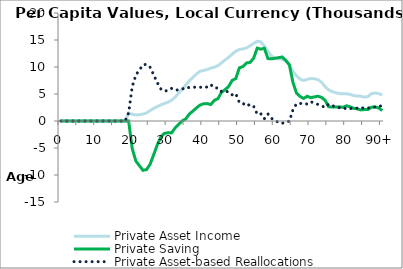
| Category | Private Asset Income | Private Saving | Private Asset-based Reallocations |
|---|---|---|---|
| 0 | 0 | 0 | 0 |
|  | 0 | 0 | 0 |
| 2 | 0 | 0 | 0 |
| 3 | 0 | 0 | 0 |
| 4 | 0 | 0 | 0 |
| 5 | 0 | 0 | 0 |
| 6 | 0 | 0 | 0 |
| 7 | 0 | 0 | 0 |
| 8 | 0 | 0 | 0 |
| 9 | 0 | 0 | 0 |
| 10 | 0 | 0 | 0 |
| 11 | 0 | 0 | 0 |
| 12 | 0 | 0 | 0 |
| 13 | 0 | 0 | 0 |
| 14 | 0 | 0 | 0 |
| 15 | 0 | 0 | 0 |
| 16 | 0 | 0 | 0 |
| 17 | 0 | 0 | 0 |
| 18 | -39.151 | 0 | -39.151 |
| 19 | 1506.614 | 0 | 1506.614 |
| 20 | 1242.833 | -5095.875 | 6338.708 |
| 21 | 1102.254 | -7388.339 | 8490.593 |
| 22 | 1173.971 | -8262.647 | 9436.618 |
| 23 | 1276.18 | -9129.099 | 10405.279 |
| 24 | 1487.969 | -9007.453 | 10495.422 |
| 25 | 1929.606 | -8025.965 | 9955.572 |
| 26 | 2313.009 | -6252.181 | 8565.191 |
| 27 | 2676.693 | -4449.359 | 7126.051 |
| 28 | 2978.54 | -2978.211 | 5956.751 |
| 29 | 3231.779 | -2301.312 | 5533.091 |
| 30 | 3481.351 | -2175.828 | 5657.179 |
| 31 | 3834.657 | -2205.33 | 6039.987 |
| 32 | 4403.03 | -1308.016 | 5711.046 |
| 33 | 5165.316 | -607.924 | 5773.24 |
| 34 | 5907.844 | 17.662 | 5890.182 |
| 35 | 6672.336 | 399.675 | 6272.66 |
| 36 | 7472.999 | 1298.698 | 6174.3 |
| 37 | 8084.598 | 1838.631 | 6245.967 |
| 38 | 8712.976 | 2443.368 | 6269.608 |
| 39 | 9206.98 | 2946.676 | 6260.303 |
| 40 | 9369.815 | 3199.581 | 6170.234 |
| 41 | 9531.844 | 3221.804 | 6310.04 |
| 42 | 9792.728 | 3054.474 | 6738.254 |
| 43 | 9959.509 | 3825.744 | 6133.765 |
| 44 | 10248.553 | 4136.157 | 6112.396 |
| 45 | 10752.905 | 5312.15 | 5440.755 |
| 46 | 11304.367 | 5806.438 | 5497.928 |
| 47 | 11795.246 | 6390.374 | 5404.872 |
| 48 | 12378.367 | 7535.84 | 4842.527 |
| 49 | 12908.547 | 7846.895 | 5061.652 |
| 50 | 13254.224 | 9842.842 | 3411.382 |
| 51 | 13346.991 | 10079.722 | 3267.269 |
| 52 | 13528.396 | 10756.121 | 2772.275 |
| 53 | 13928.622 | 10845.857 | 3082.765 |
| 54 | 14361.045 | 11631.383 | 2729.662 |
| 55 | 14763.837 | 13497.988 | 1265.849 |
| 56 | 14654.01 | 13306.07 | 1347.94 |
| 57 | 13887.711 | 13465.469 | 422.242 |
| 58 | 12878.47 | 11567.741 | 1310.73 |
| 59 | 12003.173 | 11504.278 | 498.895 |
| 60 | 11625.603 | 11615.113 | 10.49 |
| 61 | 11532.099 | 11734.809 | -202.709 |
| 62 | 11421.536 | 11856.241 | -434.705 |
| 63 | 11122.089 | 11226.214 | -104.125 |
| 64 | 10348.005 | 10407.783 | -59.778 |
| 65 | 9221.604 | 7153.893 | 2067.711 |
| 66 | 8353.127 | 5168.635 | 3184.492 |
| 67 | 7777.662 | 4545.786 | 3231.876 |
| 68 | 7483.474 | 4168.592 | 3314.882 |
| 69 | 7714.888 | 4584.522 | 3130.366 |
| 70 | 7858.101 | 4307.733 | 3550.368 |
| 71 | 7808.662 | 4460.41 | 3348.253 |
| 72 | 7665.296 | 4598.861 | 3066.435 |
| 73 | 7173.339 | 4376.043 | 2797.296 |
| 74 | 6361.005 | 3841.588 | 2519.416 |
| 75 | 5764.641 | 2634.741 | 3129.9 |
| 76 | 5438.832 | 2592.848 | 2845.985 |
| 77 | 5217.736 | 2578.829 | 2638.907 |
| 78 | 5086.653 | 2622.325 | 2464.328 |
| 79 | 5026.584 | 2532.306 | 2494.278 |
| 80 | 5037.795 | 2816.655 | 2221.14 |
| 81 | 4927.866 | 2628.543 | 2299.323 |
| 82 | 4708.25 | 2345.723 | 2362.527 |
| 83 | 4621.738 | 2248.266 | 2373.472 |
| 84 | 4596.297 | 2051.279 | 2545.018 |
| 85 | 4419.694 | 2116.208 | 2303.487 |
| 86 | 4522.962 | 2123.237 | 2399.725 |
| 87 | 5063.217 | 2552.247 | 2510.97 |
| 88 | 5195.624 | 2611.91 | 2583.715 |
| 89 | 5081.388 | 2433.568 | 2647.819 |
| 90+ | 4807.904 | 1924.614 | 2883.291 |